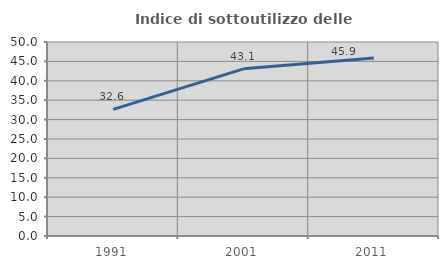
| Category | Indice di sottoutilizzo delle abitazioni  |
|---|---|
| 1991.0 | 32.64 |
| 2001.0 | 43.082 |
| 2011.0 | 45.851 |